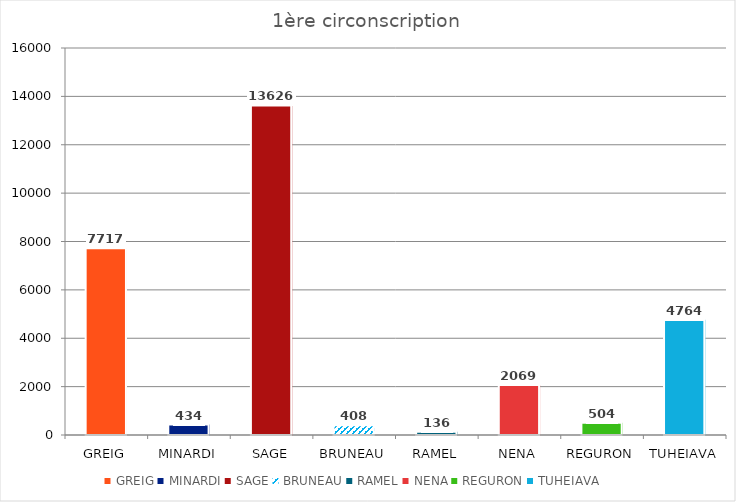
| Category | Series 0 |
|---|---|
| GREIG | 7717 |
| MINARDI | 434 |
| SAGE | 13626 |
| BRUNEAU | 408 |
| RAMEL | 136 |
| NENA | 2069 |
| REGURON | 504 |
| TUHEIAVA | 4764 |